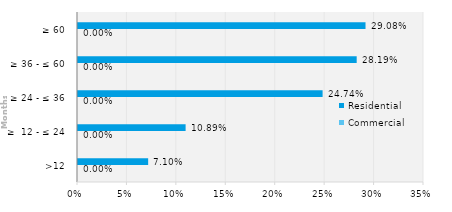
| Category | Commercial | Residential |
|---|---|---|
| >12 | 0 | 0.071 |
| ≥  12 - ≤ 24 | 0 | 0.109 |
| ≥ 24 - ≤ 36 | 0 | 0.247 |
| ≥ 36 - ≤ 60 | 0 | 0.282 |
| ≥ 60 | 0 | 0.291 |